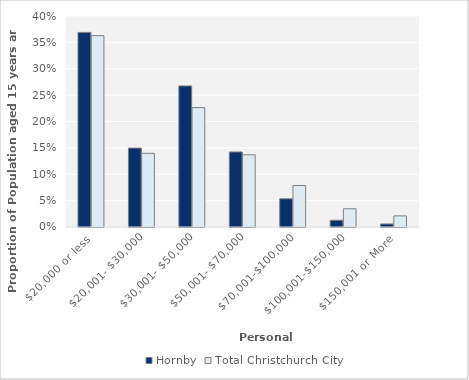
| Category | Hornby | Total Christchurch City |
|---|---|---|
| $20,000 or less | 0.369 | 0.363 |
| $20,001- $30,000 | 0.15 | 0.14 |
| $30,001- $50,000 | 0.267 | 0.226 |
| $50,001- $70,000 | 0.142 | 0.137 |
| $70,001-$100,000 | 0.053 | 0.079 |
| $100,001-$150,000 | 0.013 | 0.035 |
| $150,001 or More | 0.006 | 0.021 |